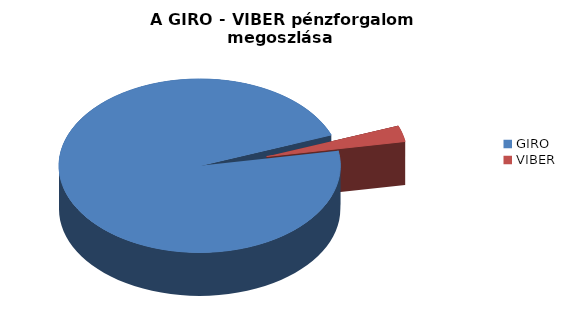
| Category | Tranzakciók száma alapján 2016-ban |
|---|---|
| GIRO | 0.97 |
| VIBER | 0.03 |